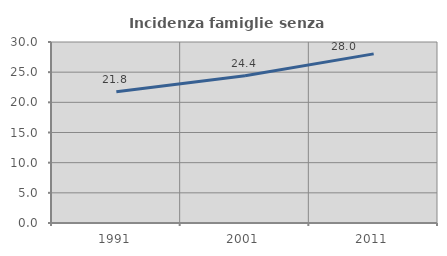
| Category | Incidenza famiglie senza nuclei |
|---|---|
| 1991.0 | 21.761 |
| 2001.0 | 24.418 |
| 2011.0 | 28.03 |